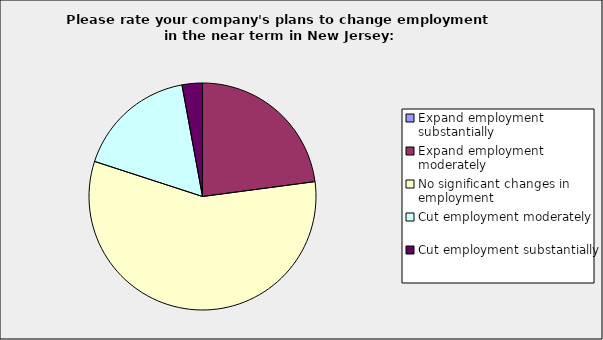
| Category | Series 0 |
|---|---|
| Expand employment substantially | 0 |
| Expand employment moderately | 0.229 |
| No significant changes in employment | 0.571 |
| Cut employment moderately | 0.171 |
| Cut employment substantially | 0.029 |